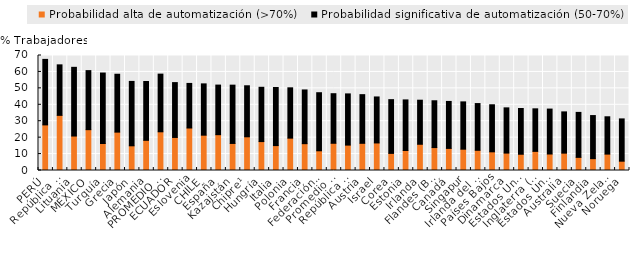
| Category | Probabilidad alta de automatización (>70%) | Probabilidad significativa de automatización (50-70%) |
|---|---|---|
| PERÚ | 27.76 | 39.87 |
| República Eslovaca | 33.56 | 30.75 |
| Lituania | 20.98 | 41.82 |
| MÉXICO | 24.86 | 35.94 |
| Turquía | 16.42 | 42.91 |
| Grecia | 23.36 | 35.23 |
| Japón | 15.03 | 39.2 |
| Alemania | 18.37 | 35.79 |
| PROMEDIO ALC | 23.56 | 35.105 |
| ECUADOR | 20.12 | 33.38 |
| Eslovenia | 25.87 | 27.13 |
| CHILE | 21.5 | 31.23 |
| España | 21.8 | 30.19 |
| Kazajstán | 16.47 | 35.48 |
| Chipre¹ | 20.52 | 31.05 |
| Hungría | 17.6 | 33.05 |
| Italia | 15.16 | 35.35 |
| Polonia | 19.7 | 30.63 |
| Francia | 16.33 | 32.7 |
| Federación Rusa² | 12 | 35.35 |
| Promedio OCDE | 16.57 | 30.18 |
| República Checa | 15.46 | 31.17 |
| Austria | 16.55 | 29.62 |
| Israel | 16.77 | 28 |
| Corea | 10.42 | 32.71 |
| Estonia | 12.19 | 30.78 |
| Irlanda | 15.97 | 26.82 |
| Flandes (Bélgica) | 13.96 | 28.49 |
| Canadá | 13.45 | 28.59 |
| Singapur | 12.97 | 28.8 |
| Irlanda del Norte (RU) | 12.3 | 28.45 |
| Países Bajos | 11.37 | 28.64 |
| Dinamarca | 10.61 | 27.52 |
| Estados Unidos (2017) | 9.9 | 27.85 |
| Inglaterra (RU) | 11.64 | 25.9 |
| Estados Unidos (2012/2014) | 10.04 | 27.35 |
| Australia | 10.57 | 25.11 |
| Suecia | 7.99 | 27.38 |
| Finlandia | 7.21 | 26.23 |
| Nueva Zelanda | 9.98 | 22.72 |
| Noruega | 5.67 | 25.74 |